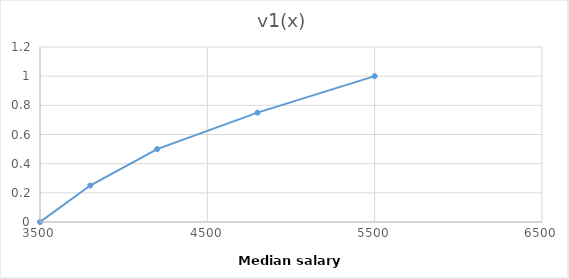
| Category | v1(x) |
|---|---|
| 3500.0 | 0 |
| 3800.0 | 0.25 |
| 4200.0 | 0.5 |
| 4800.0 | 0.75 |
| 5500.0 | 1 |